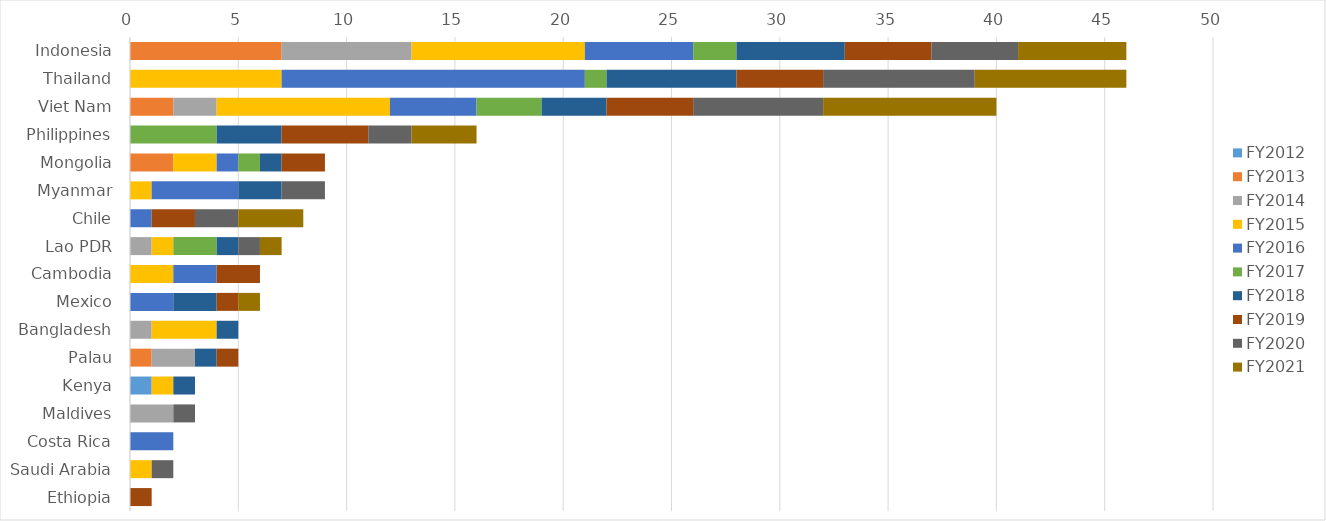
| Category | FY2012 | FY2013 | FY2014 | FY2015 | FY2016 | FY2017 | FY2018 | FY2019 | FY2020 | FY2021 |
|---|---|---|---|---|---|---|---|---|---|---|
| Indonesia | 0 | 7 | 6 | 8 | 5 | 2 | 5 | 4 | 4 | 5 |
| Thailand | 0 | 0 | 0 | 7 | 14 | 1 | 6 | 4 | 7 | 7 |
| Viet Nam | 0 | 2 | 2 | 8 | 4 | 3 | 3 | 4 | 6 | 8 |
| Philippines | 0 | 0 | 0 | 0 | 0 | 4 | 3 | 4 | 2 | 3 |
| Mongolia | 0 | 2 | 0 | 2 | 1 | 1 | 1 | 2 | 0 | 0 |
| Myanmar | 0 | 0 | 0 | 1 | 4 | 0 | 2 | 0 | 2 | 0 |
| Chile | 0 | 0 | 0 | 0 | 1 | 0 | 0 | 2 | 2 | 3 |
| Lao PDR | 0 | 0 | 1 | 1 | 0 | 2 | 1 | 0 | 1 | 1 |
| Cambodia | 0 | 0 | 0 | 2 | 2 | 0 | 0 | 2 | 0 | 0 |
| Mexico | 0 | 0 | 0 | 0 | 2 | 0 | 2 | 1 | 0 | 1 |
| Bangladesh | 0 | 0 | 1 | 3 | 0 | 0 | 1 | 0 | 0 | 0 |
| Palau | 0 | 1 | 2 | 0 | 0 | 0 | 1 | 1 | 0 | 0 |
| Kenya | 1 | 0 | 0 | 1 | 0 | 0 | 1 | 0 | 0 | 0 |
| Maldives | 0 | 0 | 2 | 0 | 0 | 0 | 0 | 0 | 1 | 0 |
| Costa Rica | 0 | 0 | 0 | 0 | 2 | 0 | 0 | 0 | 0 | 0 |
| Saudi Arabia | 0 | 0 | 0 | 1 | 0 | 0 | 0 | 0 | 1 | 0 |
| Ethiopia | 0 | 0 | 0 | 0 | 0 | 0 | 0 | 1 | 0 | 0 |